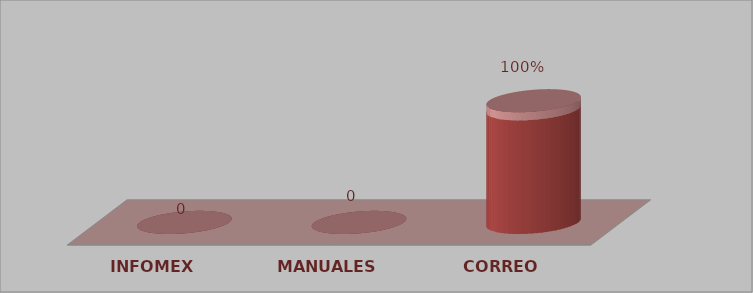
| Category | Series 0 | Series 1 |
|---|---|---|
| INFOMEX | 0 | 0 |
| MANUALES | 0 | 0 |
| CORREO | 14 | 1 |